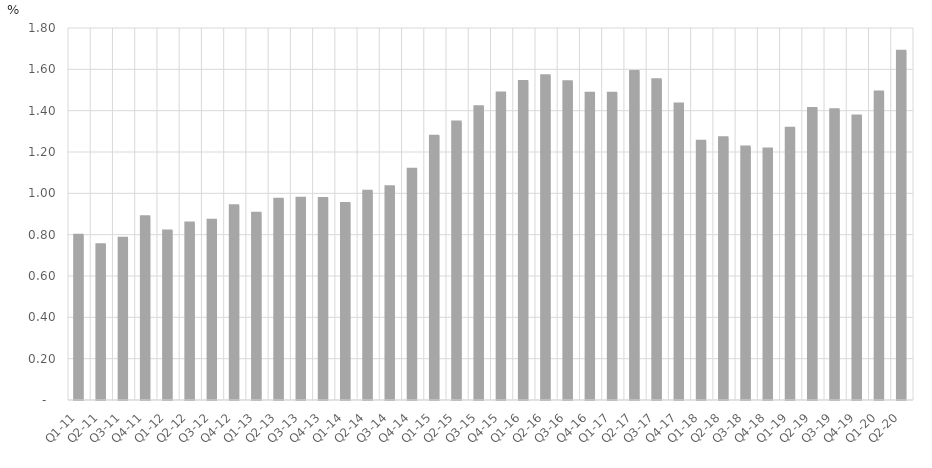
| Category | Percent of Total GDP |
|---|---|
| Q1-11 | 0.797 |
| Q2-11 | 0.751 |
| Q3-11 | 0.783 |
| Q4-11 | 0.887 |
| Q1-12 | 0.818 |
| Q2-12 | 0.857 |
| Q3-12 | 0.869 |
| Q4-12 | 0.94 |
| Q1-13 | 0.903 |
| Q2-13 | 0.972 |
| Q3-13 | 0.976 |
| Q4-13 | 0.975 |
| Q1-14 | 0.95 |
| Q2-14 | 1.01 |
| Q3-14 | 1.032 |
| Q4-14 | 1.117 |
| Q1-15 | 1.276 |
| Q2-15 | 1.345 |
| Q3-15 | 1.419 |
| Q4-15 | 1.485 |
| Q1-16 | 1.541 |
| Q2-16 | 1.57 |
| Q3-16 | 1.54 |
| Q4-16 | 1.484 |
| Q1-17 | 1.485 |
| Q2-17 | 1.59 |
| Q3-17 | 1.55 |
| Q4-17 | 1.433 |
| Q1-18 | 1.253 |
| Q2-18 | 1.268 |
| Q3-18 | 1.225 |
| Q4-18 | 1.214 |
| Q1-19 | 1.314 |
| Q2-19 | 1.41 |
| Q3-19 | 1.405 |
| Q4-19 | 1.374 |
| Q1-20 | 1.49 |
| Q2-20 | 1.688 |